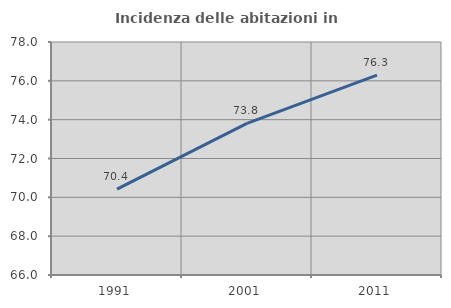
| Category | Incidenza delle abitazioni in proprietà  |
|---|---|
| 1991.0 | 70.425 |
| 2001.0 | 73.805 |
| 2011.0 | 76.292 |